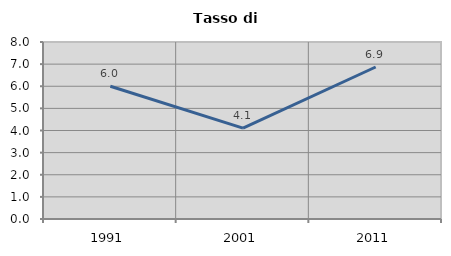
| Category | Tasso di disoccupazione   |
|---|---|
| 1991.0 | 6.002 |
| 2001.0 | 4.11 |
| 2011.0 | 6.87 |